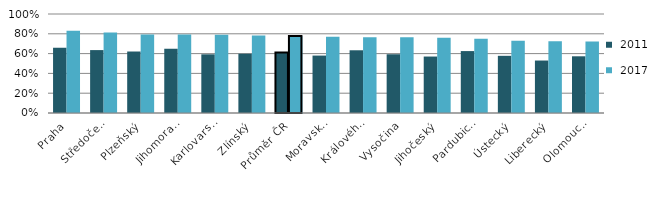
| Category |  2011 |  2017 |
|---|---|---|
|   Praha | 0.66 | 0.832 |
|   Středočeský | 0.635 | 0.814 |
|   Plzeňský | 0.621 | 0.793 |
|   Jihomoravský | 0.65 | 0.793 |
|   Karlovarský | 0.593 | 0.79 |
|   Zlínský | 0.599 | 0.784 |
| Průměr ČR | 0.61 | 0.779 |
|   Moravskoslezský | 0.58 | 0.771 |
|   Královéhradecký | 0.634 | 0.766 |
|   Vysočina | 0.593 | 0.766 |
|   Jihočeský | 0.57 | 0.761 |
|   Pardubický | 0.625 | 0.749 |
|   Ústecký | 0.578 | 0.73 |
|   Liberecký | 0.53 | 0.725 |
|   Olomoucký | 0.573 | 0.721 |